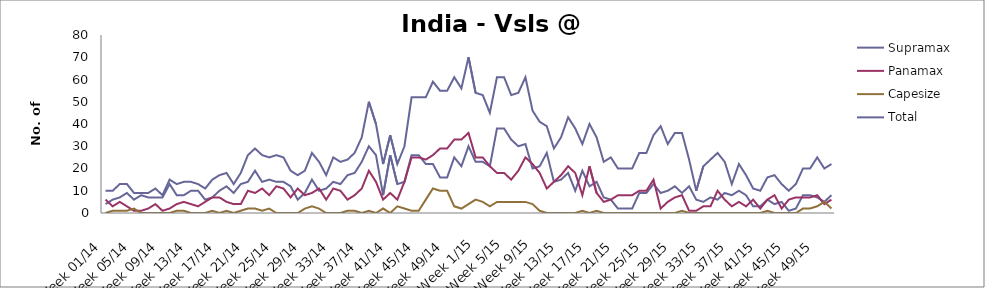
| Category | Supramax | Panamax | Capesize | Total |
|---|---|---|---|---|
| Week 01/14 | 4 | 6 | 0 | 10 |
| Week 02/14 | 6 | 3 | 1 | 10 |
| Week 03/14 | 7 | 5 | 1 | 13 |
| Week 04/14 | 9 | 3 | 1 | 13 |
| Week 05/14 | 6 | 1 | 2 | 9 |
| Week 06/14 | 8 | 1 | 0 | 9 |
| Week 07/14 | 7 | 2 | 0 | 9 |
| Week 08/14 | 7 | 4 | 0 | 11 |
| Week 09/14 | 7 | 1 | 0 | 8 |
| Week 10/14 | 13 | 2 | 0 | 15 |
| Week 11/14 | 8 | 4 | 1 | 13 |
| Week 12/14 | 8 | 5 | 1 | 14 |
| Week 13/14 | 10 | 4 | 0 | 14 |
| Week 14/14 | 10 | 3 | 0 | 13 |
| Week 15/14 | 6 | 5 | 0 | 11 |
| Week 16/14 | 7 | 7 | 1 | 15 |
| Week 17/14 | 10 | 7 | 0 | 17 |
| Week 18/14 | 12 | 5 | 1 | 18 |
| Week 19/14 | 9 | 4 | 0 | 13 |
| Week 20/14 | 13 | 4 | 1 | 18 |
| Week 21/14 | 14 | 10 | 2 | 26 |
| Week 22/14 | 19 | 9 | 2 | 29 |
| Week 23/14 | 14 | 11 | 1 | 26 |
| Week 24/14 | 15 | 8 | 2 | 25 |
| Week 25/14 | 14 | 12 | 0 | 26 |
| Week 26/14 | 14 | 11 | 0 | 25 |
| Week 27/14 | 12 | 7 | 0 | 19 |
| Week 28/14 | 6 | 11 | 0 | 17 |
| Week 29/14 | 9 | 8 | 2 | 19 |
| Week 30/14 | 15 | 9 | 3 | 27 |
| Week 31/14 | 10 | 11 | 2 | 23 |
| Week 32/14 | 11 | 6 | 0 | 17 |
| Week 33/14 | 14 | 11 | 0 | 25 |
| Week 34/14 | 13 | 10 | 0 | 23 |
| Week 35/14 | 17 | 6 | 1 | 24 |
| Week 36/14 | 18 | 8 | 1 | 27 |
| Week 37/14 | 23 | 11 | 0 | 34 |
| Week 38/14 | 30 | 19 | 1 | 50 |
| Week 39/14 | 26 | 14 | 0 | 40 |
| Week 40/14 | 8 | 6 | 2 | 22 |
| Week 41/14 | 26 | 9 | 0 | 35 |
| Week 42/14 | 13 | 6 | 3 | 22 |
| Week 43/14 | 14 | 14 | 2 | 30 |
| Week 44/14 | 26 | 25 | 1 | 52 |
| Week 45/14 | 26 | 25 | 1 | 52 |
| Week 46/14 | 22 | 24 | 6 | 52 |
| Week 47/14 | 22 | 26 | 11 | 59 |
| Week 48/14 | 16 | 29 | 10 | 55 |
| Week 49/14 | 16 | 29 | 10 | 55 |
| Week 50/14 | 25 | 33 | 3 | 61 |
| Week 51/14 | 21 | 33 | 2 | 56 |
| Week 52/14 | 30 | 36 | 4 | 70 |
| Week 1/15 | 23 | 25 | 6 | 54 |
| Week 2/15 | 23 | 25 | 5 | 53 |
| Week 3/15 | 21 | 21 | 3 | 45 |
| Week 4/15 | 38 | 18 | 5 | 61 |
| Week 5/15 | 38 | 18 | 5 | 61 |
| Week 6/15 | 33 | 15 | 5 | 53 |
| Week 7/15 | 30 | 19 | 5 | 54 |
| Week 8/15 | 31 | 25 | 5 | 61 |
| Week 9/15 | 20 | 22 | 4 | 46 |
| Week 10/15 | 21 | 18 | 1 | 41 |
| Week 11/15 | 27 | 11 | 0 | 39 |
| Week 12/15 | 14 | 14 | 0 | 29 |
| Week 13/15 | 15 | 17 | 0 | 34 |
| Week 14/15 | 18 | 21 | 0 | 43 |
| Week 15/15 | 10 | 18 | 0 | 38 |
| Week 16/15 | 19 | 8 | 1 | 31 |
| Week 17/15 | 12 | 21 | 0 | 40 |
| Week 18/15 | 14 | 9 | 1 | 34 |
| Week 19/15 | 7 | 5 | 0 | 23 |
| Week 20/15 | 6 | 6 | 0 | 25 |
| Week 21/15 | 2 | 8 | 0 | 20 |
| Week 22/15 | 2 | 8 | 0 | 20 |
| Week 23/15 | 2 | 8 | 0 | 20 |
| Week 24/15 | 9 | 10 | 0 | 27 |
| Week 25/15 | 9 | 10 | 0 | 27 |
| Week 26/15 | 13 | 15 | 0 | 35 |
| Week 27/15 | 9 | 2 | 0 | 39 |
| Week 28/15 | 10 | 5 | 0 | 31 |
| Week 29/15 | 12 | 7 | 0 | 36 |
| Week 30/15 | 9 | 8 | 1 | 36 |
| Week 31/15 | 12 | 1 | 0 | 24 |
| Week 32/15 | 6 | 1 | 0 | 10 |
| Week 33/15 | 5 | 3 | 0 | 21 |
| Week 34/15 | 7 | 3 | 0 | 24 |
| Week 35/15 | 6 | 10 | 0 | 27 |
| Week 36/15 | 9 | 6 | 0 | 23 |
| Week 37/15 | 8 | 3 | 0 | 13 |
| Week 38/15 | 10 | 5 | 0 | 22 |
| Week 39/15 | 8 | 3 | 0 | 17 |
| Week 40/15 | 3 | 6 | 0 | 11 |
| Week 41/15 | 3 | 2 | 0 | 10 |
| Week 42/15 | 6 | 6 | 1 | 16 |
| Week 43/15 | 4 | 8 | 0 | 17 |
| Week 44/15 | 5 | 2 | 0 | 13 |
| Week 45/15 | 1 | 6 | 0 | 10 |
| Week 46/15 | 2 | 7 | 0 | 13 |
| Week 47/15 | 8 | 7 | 2 | 20 |
| Week 48/15 | 8 | 7 | 2 | 20 |
| Week 49/15 | 7 | 8 | 3 | 25 |
| Week 50/15 | 5 | 4 | 5 | 20 |